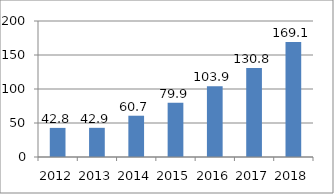
| Category | Series 0 |
|---|---|
| 2012.0 | 42.8 |
| 2013.0 | 42.9 |
| 2014.0 | 60.7 |
| 2015.0 | 79.9 |
| 2016.0 | 103.9 |
| 2017.0 | 130.8 |
| 2018.0 | 169.1 |